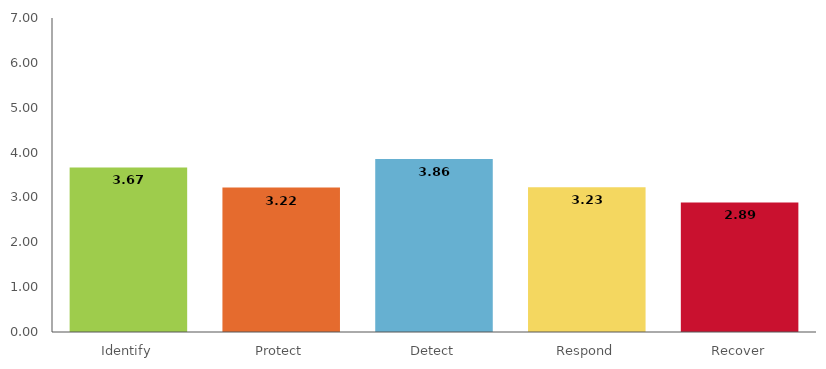
| Category | Series 1 |
|---|---|
| Identify | 3.669 |
| Protect | 3.221 |
| Detect | 3.856 |
| Respond | 3.227 |
| Recover | 2.889 |